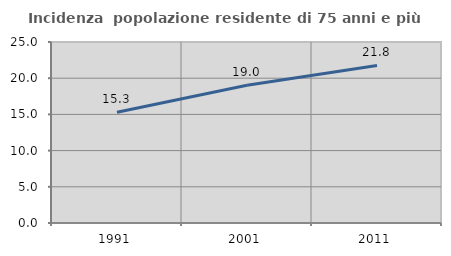
| Category | Incidenza  popolazione residente di 75 anni e più |
|---|---|
| 1991.0 | 15.306 |
| 2001.0 | 19.029 |
| 2011.0 | 21.756 |